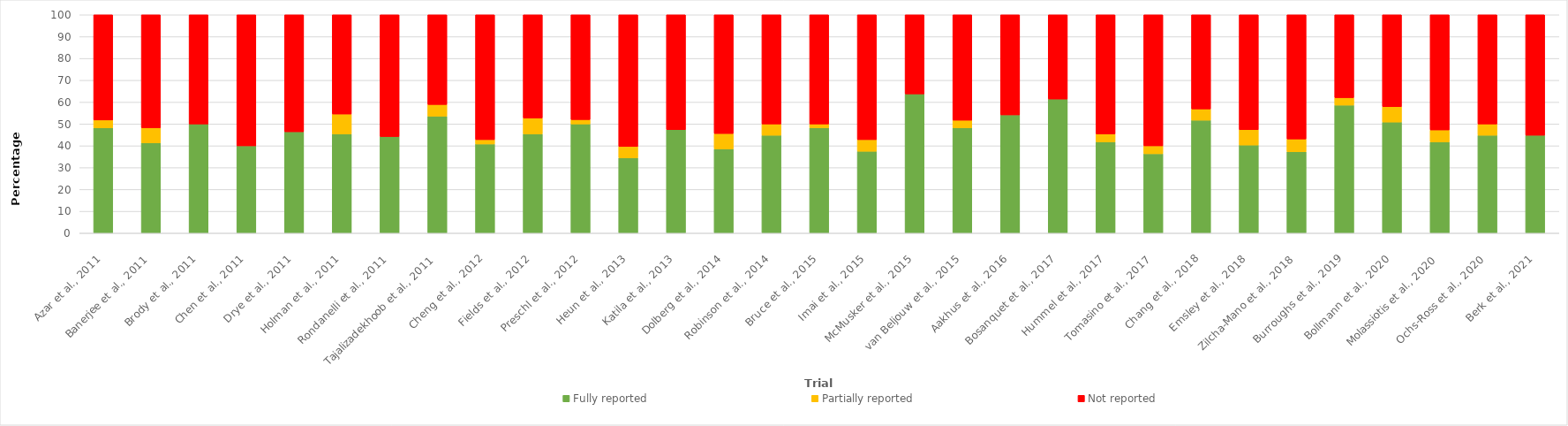
| Category | Fully reported | Partially reported | Not reported |
|---|---|---|---|
| Azar et al., 2011 | 48.214 | 3.571 | 48.214 |
| Banerjee et al., 2011 | 41.379 | 6.897 | 51.724 |
| Brody et al., 2011 | 50 | 0 | 50 |
| Chen et al., 2011 | 40 | 0 | 60 |
| Drye et al., 2011 | 46.429 | 0 | 53.571 |
| Holman et al., 2011 | 45.455 | 9.091 | 45.455 |
| Rondanelli et al., 2011 | 44.231 | 0 | 55.769 |
| Tajalizadekhoob et al., 2011 | 53.571 | 5.357 | 41.071 |
| Cheng et al., 2012 | 40.816 | 2.041 | 57.143 |
| Fields et al., 2012 | 45.455 | 7.273 | 47.273 |
| Preschl et al., 2012 | 50 | 2 | 48 |
| Heun et al., 2013 | 34.483 | 5.172 | 60.345 |
| Katila et al., 2013 | 47.368 | 0 | 52.632 |
| Dolberg et al., 2014 | 38.596 | 7.018 | 54.386 |
| Robinson et al., 2014 | 44.828 | 5.172 | 50 |
| Bruce et al., 2015 | 48.276 | 1.724 | 50 |
| Imai et al., 2015 | 37.5 | 5.357 | 57.143 |
| McMusker et al., 2015 | 63.793 | 0 | 36.207 |
| van Beljouw et al., 2015 | 48.276 | 3.448 | 48.276 |
| Aakhus et al., 2016 | 54.167 | 0 | 45.833 |
| Bosanquet et al., 2017 | 61.404 | 0 | 38.596 |
| Hummel et al., 2017 | 41.818 | 3.636 | 54.545 |
| Tomasino et al., 2017 | 36.364 | 3.636 | 60 |
| Chang et al., 2018 | 51.724 | 5.172 | 43.103 |
| Emsley et al., 2018 | 40.351 | 7.018 | 52.632 |
| Zilcha-Mano et al., 2018 | 37.255 | 5.882 | 56.863 |
| Burroughs et al., 2019 | 58.621 | 3.448 | 37.931 |
| Bollmann et al., 2020 | 50.877 | 7.018 | 42.105 |
| Molassiotis et al., 2020 | 41.818 | 5.455 | 52.727 |
| Ochs-Ross et al., 2020 | 44.828 | 5.172 | 50 |
| Berk et al., 2021 | 44.828 | 0 | 55.172 |